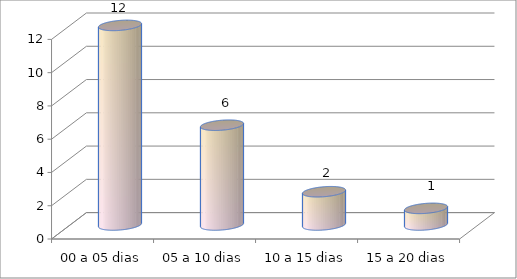
| Category | Series 0 |
|---|---|
| 00 a 05 dias | 12 |
| 05 a 10 dias | 6 |
| 10 a 15 dias | 2 |
| 15 a 20 dias | 1 |